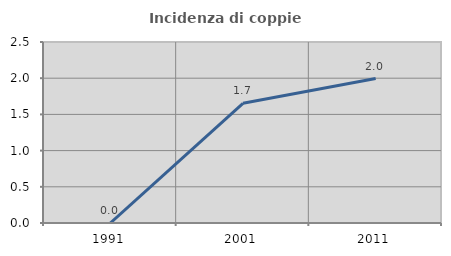
| Category | Incidenza di coppie miste |
|---|---|
| 1991.0 | 0 |
| 2001.0 | 1.653 |
| 2011.0 | 1.995 |